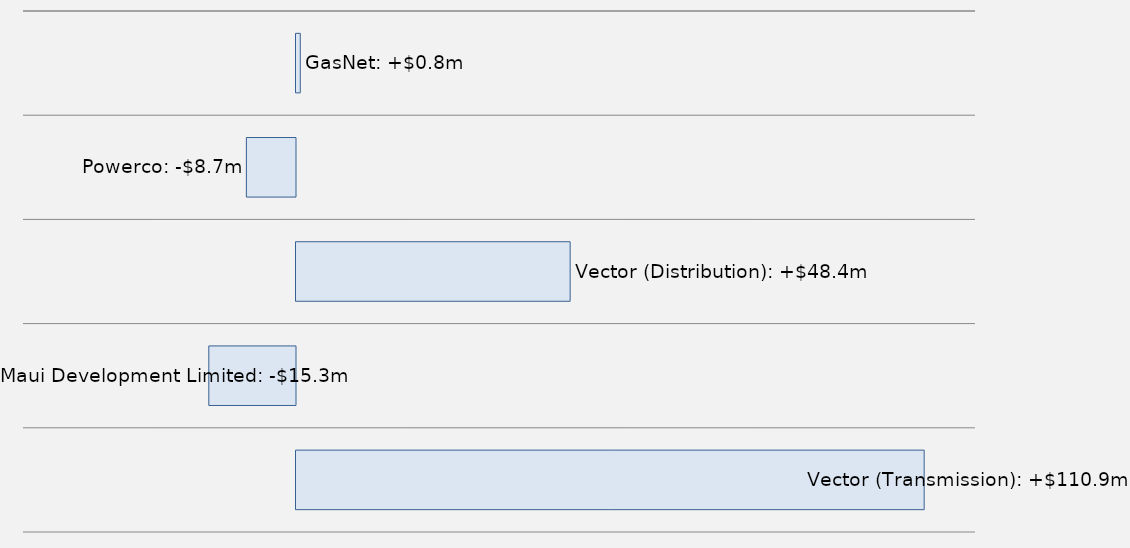
| Category | Series 0 |
|---|---|
| GasNet | 754.66 |
| Powerco | -8666.587 |
| Vector (Distribution) | 48378.105 |
| Maui Development Limited | -15296.536 |